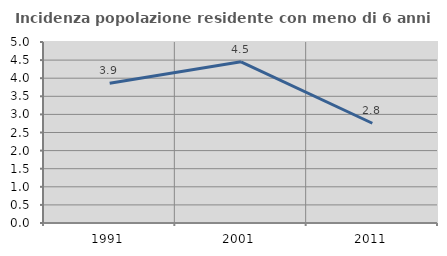
| Category | Incidenza popolazione residente con meno di 6 anni |
|---|---|
| 1991.0 | 3.859 |
| 2001.0 | 4.452 |
| 2011.0 | 2.756 |